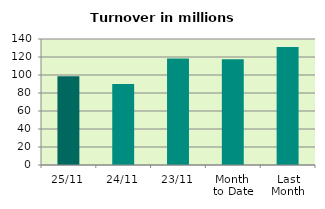
| Category | Series 0 |
|---|---|
| 25/11 | 98.661 |
| 24/11 | 90.062 |
| 23/11 | 118.455 |
| Month 
to Date | 117.594 |
| Last
Month | 131.017 |